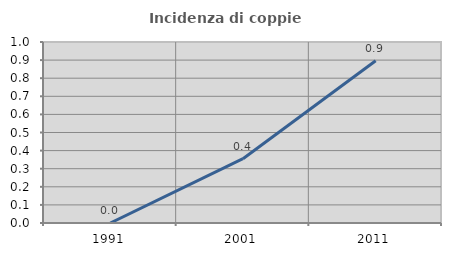
| Category | Incidenza di coppie miste |
|---|---|
| 1991.0 | 0 |
| 2001.0 | 0.355 |
| 2011.0 | 0.896 |